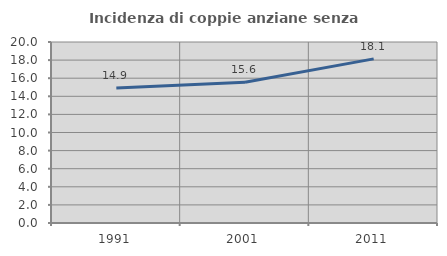
| Category | Incidenza di coppie anziane senza figli  |
|---|---|
| 1991.0 | 14.921 |
| 2001.0 | 15.558 |
| 2011.0 | 18.133 |